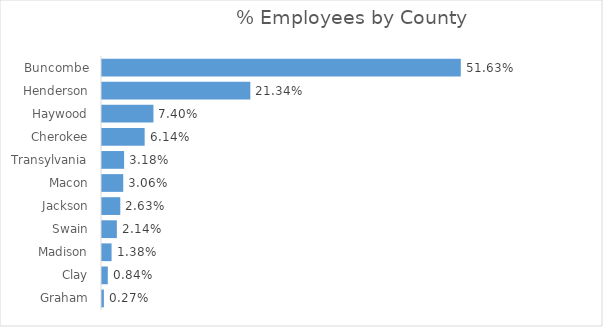
| Category | Total |
|---|---|
| Buncombe | 0.516 |
| Henderson | 0.213 |
| Haywood | 0.074 |
| Cherokee | 0.061 |
| Transylvania | 0.032 |
| Macon | 0.031 |
| Jackson | 0.026 |
| Swain | 0.021 |
| Madison | 0.014 |
| Clay | 0.008 |
| Graham | 0.003 |